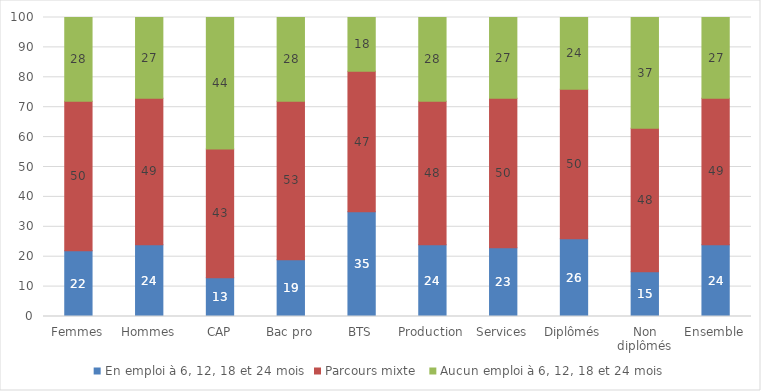
| Category | En emploi à 6, 12, 18 et 24 mois  | Parcours mixte  | Aucun emploi à 6, 12, 18 et 24 mois  |
|---|---|---|---|
| Femmes | 22 | 50 | 28 |
| Hommes | 24 | 49 | 27 |
| CAP | 13 | 43 | 44 |
| Bac pro | 19 | 53 | 28 |
| BTS | 35 | 47 | 18 |
| Production | 24 | 48 | 28 |
| Services | 23 | 50 | 27 |
| Diplômés | 26 | 50 | 24 |
| Non diplômés | 15 | 48 | 37 |
| Ensemble | 24 | 49 | 27 |